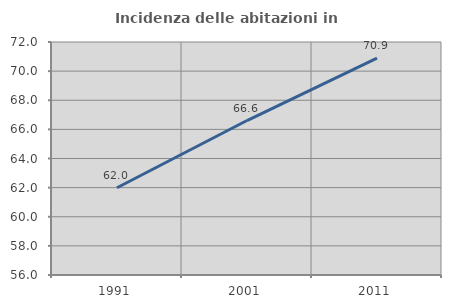
| Category | Incidenza delle abitazioni in proprietà  |
|---|---|
| 1991.0 | 61.993 |
| 2001.0 | 66.607 |
| 2011.0 | 70.888 |